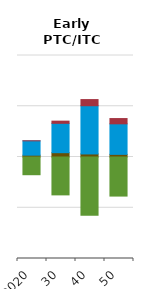
| Category | Coal | Gas & oil | Nuclear | Renewables |
|---|---|---|---|---|
| 2020.0 | 7.141 | 56.591 | 0.013 | -69.814 |
| 30.0 | 17.015 | 115.673 | 8.605 | -149.279 |
| 40.0 | 12.032 | 190.005 | 24.262 | -229.599 |
| 50.0 | 10.391 | 120.349 | 20.777 | -154.011 |